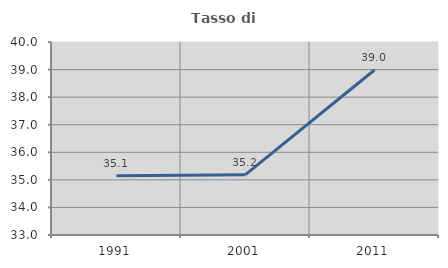
| Category | Tasso di occupazione   |
|---|---|
| 1991.0 | 35.145 |
| 2001.0 | 35.189 |
| 2011.0 | 38.984 |